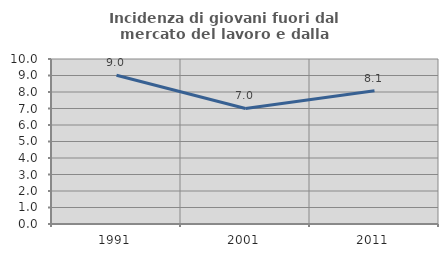
| Category | Incidenza di giovani fuori dal mercato del lavoro e dalla formazione  |
|---|---|
| 1991.0 | 9.01 |
| 2001.0 | 7.002 |
| 2011.0 | 8.075 |